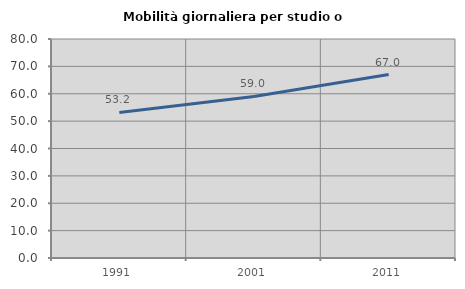
| Category | Mobilità giornaliera per studio o lavoro |
|---|---|
| 1991.0 | 53.183 |
| 2001.0 | 59.029 |
| 2011.0 | 67.002 |